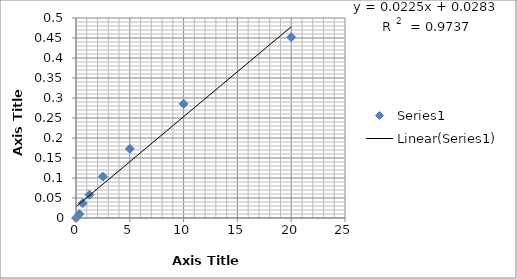
| Category | Series 0 |
|---|---|
| 20.0 | 0.452 |
| 10.0 | 0.286 |
| 5.0 | 0.173 |
| 2.5 | 0.104 |
| 1.25 | 0.058 |
| 0.625 | 0.037 |
| 0.312 | 0.01 |
| 0.0 | 0 |